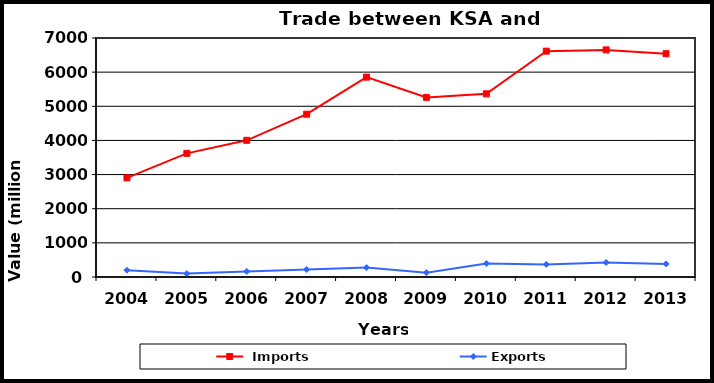
| Category |  Imports | Exports |
|---|---|---|
| 2004.0 | 2904 | 199 |
| 2005.0 | 3622 | 99 |
| 2006.0 | 4004 | 163 |
| 2007.0 | 4768 | 219 |
| 2008.0 | 5854 | 275 |
| 2009.0 | 5261 | 128 |
| 2010.0 | 5365 | 395 |
| 2011.0 | 6615 | 369 |
| 2012.0 | 6652 | 426 |
| 2013.0 | 6540 | 384 |